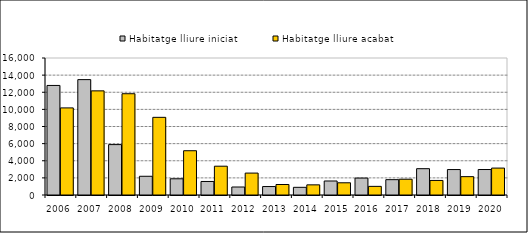
| Category | Habitatge lliure iniciat | Habitatge lliure acabat |
|---|---|---|
| 2006.0 | 12795 | 10172 |
| 2007.0 | 13475 | 12162 |
| 2008.0 | 5886 | 11827 |
| 2009.0 | 2187 | 9071 |
| 2010.0 | 1894 | 5171 |
| 2011.0 | 1580 | 3364 |
| 2012.0 | 934 | 2559 |
| 2013.0 | 989 | 1226 |
| 2014.0 | 896 | 1186 |
| 2015.0 | 1636 | 1426 |
| 2016.0 | 1977 | 1009 |
| 2017.0 | 1791 | 1842 |
| 2018.0 | 3073 | 1699 |
| 2019.0 | 2971 | 2144 |
| 2020.0 | 2976 | 3143 |